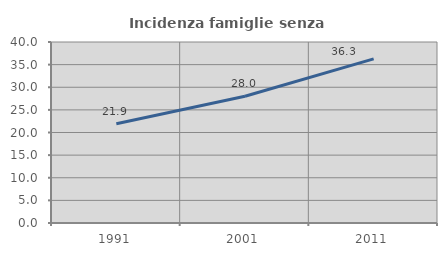
| Category | Incidenza famiglie senza nuclei |
|---|---|
| 1991.0 | 21.943 |
| 2001.0 | 28 |
| 2011.0 | 36.26 |